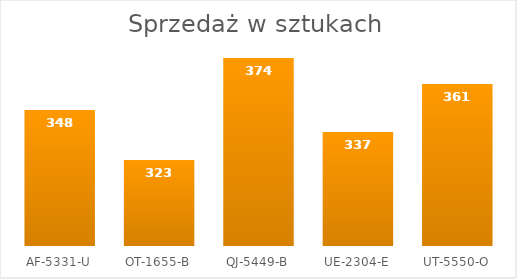
| Category | Suma |
|---|---|
| AF-5331-U | 348 |
| OT-1655-B | 323 |
| QJ-5449-B | 374 |
| UE-2304-E | 337 |
| UT-5550-O | 361 |